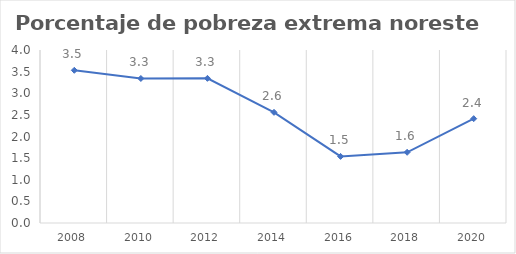
| Category | Series 0 |
|---|---|
| 2008.0 | 3.531 |
| 2010.0 | 3.341 |
| 2012.0 | 3.344 |
| 2014.0 | 2.559 |
| 2016.0 | 1.54 |
| 2018.0 | 1.635 |
| 2020.0 | 2.412 |